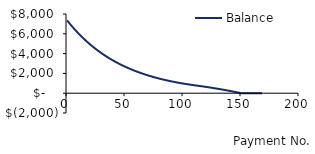
| Category |  Balance  |
|---|---|
| 1.0 | 7350 |
| 2.0 | 7203 |
| 3.0 | 7058.94 |
| 4.0 | 6917.761 |
| 5.0 | 6779.406 |
| 6.0 | 6643.818 |
| 7.0 | 6510.941 |
| 8.0 | 6380.723 |
| 9.0 | 6253.108 |
| 10.0 | 6128.046 |
| 11.0 | 6005.485 |
| 12.0 | 5885.375 |
| 13.0 | 5767.668 |
| 14.0 | 5652.315 |
| 15.0 | 5539.268 |
| 16.0 | 5428.483 |
| 17.0 | 5319.913 |
| 18.0 | 5213.515 |
| 19.0 | 5109.245 |
| 20.0 | 5007.06 |
| 21.0 | 4906.919 |
| 22.0 | 4808.78 |
| 23.0 | 4712.605 |
| 24.0 | 4618.353 |
| 25.0 | 4525.985 |
| 26.0 | 4435.466 |
| 27.0 | 4346.756 |
| 28.0 | 4259.821 |
| 29.0 | 4174.625 |
| 30.0 | 4091.132 |
| 31.0 | 4009.31 |
| 32.0 | 3929.124 |
| 33.0 | 3850.541 |
| 34.0 | 3773.53 |
| 35.0 | 3698.06 |
| 36.0 | 3624.098 |
| 37.0 | 3551.616 |
| 38.0 | 3480.584 |
| 39.0 | 3410.972 |
| 40.0 | 3342.753 |
| 41.0 | 3275.898 |
| 42.0 | 3210.38 |
| 43.0 | 3146.172 |
| 44.0 | 3083.249 |
| 45.0 | 3021.584 |
| 46.0 | 2961.152 |
| 47.0 | 2901.929 |
| 48.0 | 2843.891 |
| 49.0 | 2787.013 |
| 50.0 | 2731.273 |
| 51.0 | 2676.647 |
| 52.0 | 2623.114 |
| 53.0 | 2570.652 |
| 54.0 | 2519.239 |
| 55.0 | 2468.854 |
| 56.0 | 2419.477 |
| 57.0 | 2371.087 |
| 58.0 | 2323.666 |
| 59.0 | 2277.192 |
| 60.0 | 2231.649 |
| 61.0 | 2187.016 |
| 62.0 | 2143.275 |
| 63.0 | 2100.41 |
| 64.0 | 2058.402 |
| 65.0 | 2017.234 |
| 66.0 | 1976.889 |
| 67.0 | 1937.351 |
| 68.0 | 1898.604 |
| 69.0 | 1860.632 |
| 70.0 | 1823.419 |
| 71.0 | 1786.951 |
| 72.0 | 1751.212 |
| 73.0 | 1716.188 |
| 74.0 | 1681.864 |
| 75.0 | 1648.227 |
| 76.0 | 1615.262 |
| 77.0 | 1582.957 |
| 78.0 | 1551.298 |
| 79.0 | 1520.272 |
| 80.0 | 1489.866 |
| 81.0 | 1460.069 |
| 82.0 | 1430.868 |
| 83.0 | 1402.25 |
| 84.0 | 1374.205 |
| 85.0 | 1346.721 |
| 86.0 | 1319.787 |
| 87.0 | 1293.391 |
| 88.0 | 1267.523 |
| 89.0 | 1242.173 |
| 90.0 | 1217.329 |
| 91.0 | 1192.983 |
| 92.0 | 1169.123 |
| 93.0 | 1145.741 |
| 94.0 | 1122.826 |
| 95.0 | 1100.369 |
| 96.0 | 1078.362 |
| 97.0 | 1056.795 |
| 98.0 | 1035.659 |
| 99.0 | 1014.946 |
| 100.0 | 994.647 |
| 101.0 | 974.754 |
| 102.0 | 955.259 |
| 103.0 | 936.153 |
| 104.0 | 917.43 |
| 105.0 | 899.082 |
| 106.0 | 881.1 |
| 107.0 | 863.478 |
| 108.0 | 846.209 |
| 109.0 | 829.284 |
| 110.0 | 812.699 |
| 111.0 | 796.445 |
| 112.0 | 780.516 |
| 113.0 | 764.622 |
| 114.0 | 748.542 |
| 115.0 | 732.275 |
| 116.0 | 715.819 |
| 117.0 | 699.17 |
| 118.0 | 682.327 |
| 119.0 | 665.287 |
| 120.0 | 648.049 |
| 121.0 | 630.61 |
| 122.0 | 612.967 |
| 123.0 | 595.118 |
| 124.0 | 577.061 |
| 125.0 | 558.793 |
| 126.0 | 540.313 |
| 127.0 | 521.616 |
| 128.0 | 502.702 |
| 129.0 | 483.567 |
| 130.0 | 464.208 |
| 131.0 | 444.624 |
| 132.0 | 424.811 |
| 133.0 | 404.768 |
| 134.0 | 384.49 |
| 135.0 | 363.976 |
| 136.0 | 343.222 |
| 137.0 | 322.226 |
| 138.0 | 300.985 |
| 139.0 | 279.497 |
| 140.0 | 257.758 |
| 141.0 | 235.765 |
| 142.0 | 213.516 |
| 143.0 | 191.007 |
| 144.0 | 168.235 |
| 145.0 | 145.198 |
| 146.0 | 121.892 |
| 147.0 | 98.314 |
| 148.0 | 74.461 |
| 149.0 | 50.329 |
| 150.0 | 25.917 |
| 151.0 | 1.219 |
| 152.0 | 0 |